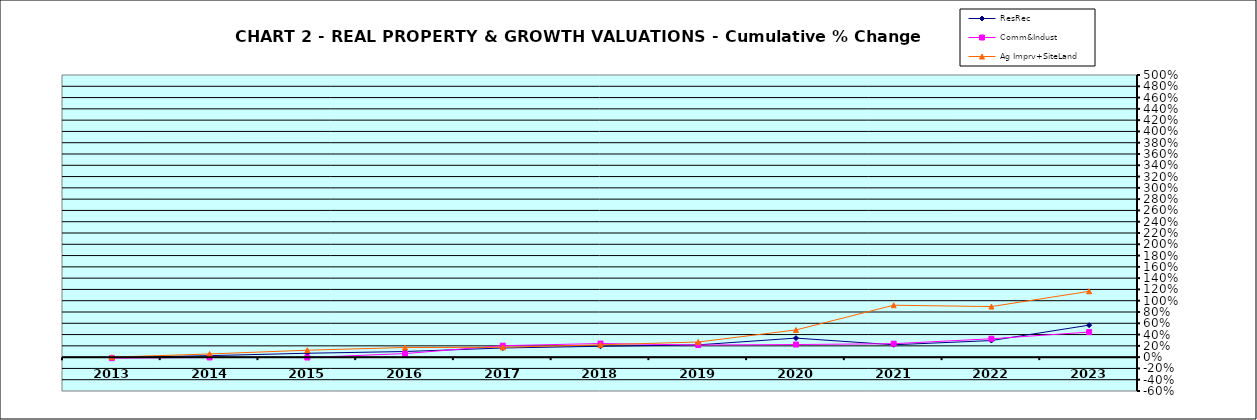
| Category | ResRec | Comm&Indust | Ag Imprv+SiteLand |
|---|---|---|---|
| 2013.0 | -0.008 | -0.018 | 0 |
| 2014.0 | 0.027 | -0.006 | 0.056 |
| 2015.0 | 0.069 | -0.007 | 0.123 |
| 2016.0 | 0.099 | 0.063 | 0.171 |
| 2017.0 | 0.162 | 0.203 | 0.174 |
| 2018.0 | 0.192 | 0.241 | 0.219 |
| 2019.0 | 0.218 | 0.215 | 0.268 |
| 2020.0 | 0.337 | 0.223 | 0.482 |
| 2021.0 | 0.219 | 0.238 | 0.92 |
| 2022.0 | 0.294 | 0.326 | 0.896 |
| 2023.0 | 0.567 | 0.444 | 1.166 |